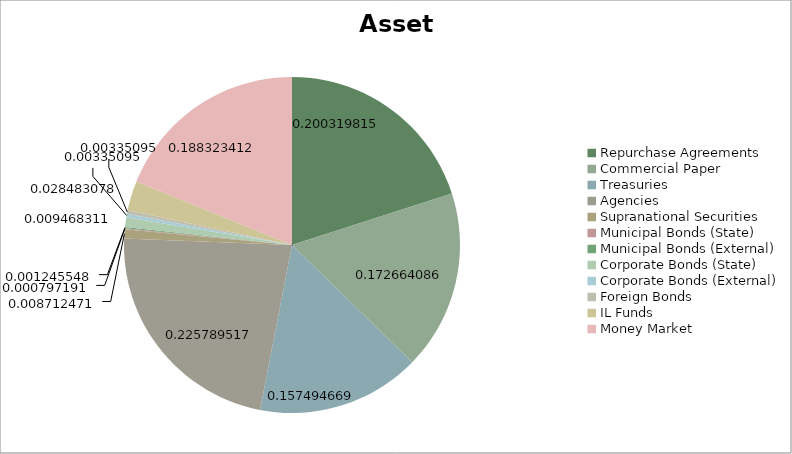
| Category | Series 0 | Series 1 |
|---|---|---|
| Repurchase Agreements | 2989000000 | 0.2 |
| Commercial Paper | 2576345000 | 0.173 |
| Treasuries | 2350000000 | 0.157 |
| Agencies | 3369037000 | 0.226 |
| Supranational Securities | 130000000 | 0.009 |
| Municipal Bonds (State) | 11895000 | 0.001 |
| Municipal Bonds (External) | 18585000 | 0.001 |
| Corporate Bonds (State) | 141278000 | 0.009 |
| Corporate Bonds (External) | 50000000 | 0.003 |
| Foreign Bonds | 50000000 | 0.003 |
| IL Funds | 425000000 | 0.028 |
| Money Market | 2810000000 | 0.188 |